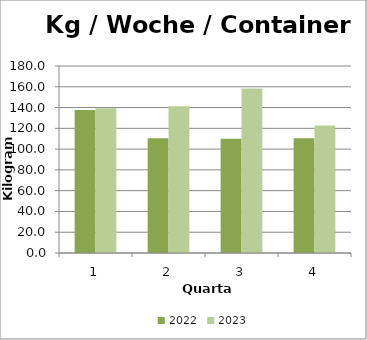
| Category | 2022 | 2023 |
|---|---|---|
| 0 | 137.692 | 139.231 |
| 1 | 110.385 | 141.154 |
| 2 | 110 | 158.462 |
| 3 | 110.385 | 122.692 |